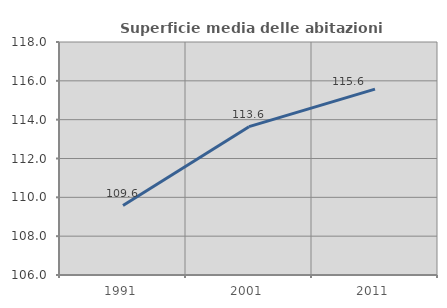
| Category | Superficie media delle abitazioni occupate |
|---|---|
| 1991.0 | 109.575 |
| 2001.0 | 113.639 |
| 2011.0 | 115.572 |